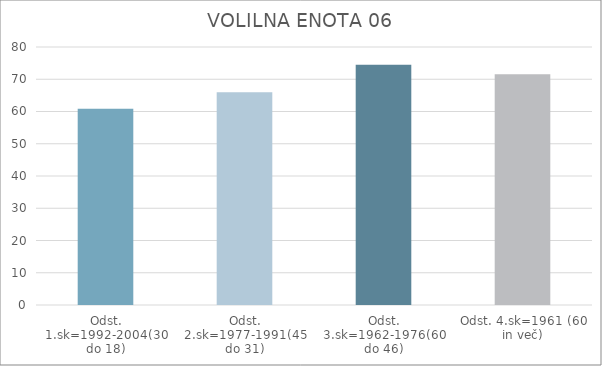
| Category | Series 0 |
|---|---|
| Odst. 1.sk=1992-2004(30 do 18) | 60.85 |
| Odst. 2.sk=1977-1991(45 do 31) | 65.95 |
| Odst. 3.sk=1962-1976(60 do 46) | 74.46 |
| Odst. 4.sk=1961 (60 in več) | 71.58 |